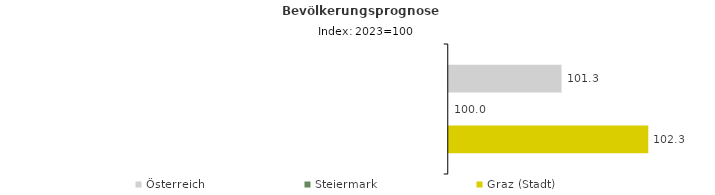
| Category | Österreich | Steiermark | Graz (Stadt) |
|---|---|---|---|
| 2023.0 | 101.3 | 100 | 102.3 |